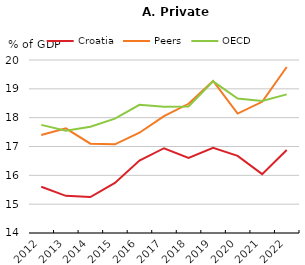
| Category | Croatia | Peers | OECD |
|---|---|---|---|
| 2012-01-01 | 15.604 | 17.397 | 17.75 |
| 2013-01-01 | 15.288 | 17.631 | 17.55 |
| 2014-01-01 | 15.246 | 17.099 | 17.685 |
| 2015-01-01 | 15.739 | 17.075 | 17.967 |
| 2016-01-01 | 16.512 | 17.478 | 18.445 |
| 2017-01-01 | 16.94 | 18.055 | 18.378 |
| 2018-01-01 | 16.602 | 18.482 | 18.388 |
| 2019-01-01 | 16.954 | 19.271 | 19.258 |
| 2020-01-01 | 16.675 | 18.143 | 18.662 |
| 2021-01-01 | 16.041 | 18.549 | 18.575 |
| 2022-01-01 | 16.881 | 19.759 | 18.807 |